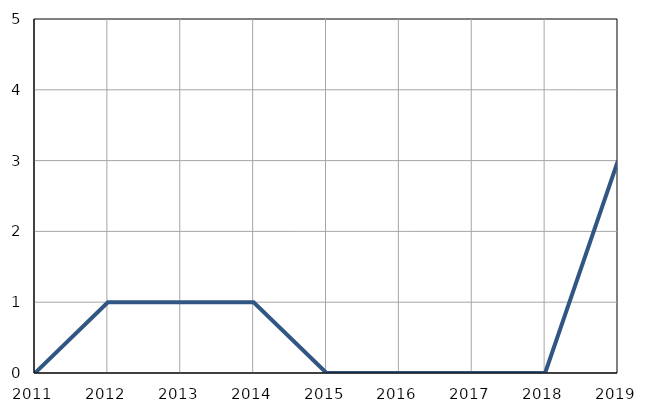
| Category | Infants
deaths |
|---|---|
| 2011.0 | 0 |
| 2012.0 | 1 |
| 2013.0 | 1 |
| 2014.0 | 1 |
| 2015.0 | 0 |
| 2016.0 | 0 |
| 2017.0 | 0 |
| 2018.0 | 0 |
| 2019.0 | 3 |